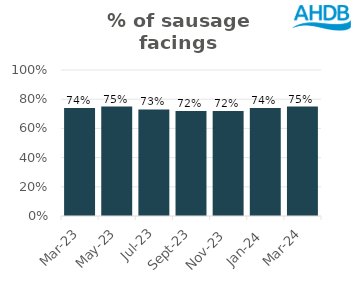
| Category | Sausage |
|---|---|
| 2023-03-01 | 0.74 |
| 2023-05-01 | 0.75 |
| 2023-07-01 | 0.73 |
| 2023-09-01 | 0.72 |
| 2023-11-01 | 0.72 |
| 2024-01-01 | 0.74 |
| 2024-03-01 | 0.75 |